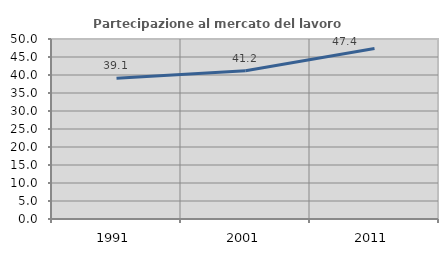
| Category | Partecipazione al mercato del lavoro  femminile |
|---|---|
| 1991.0 | 39.12 |
| 2001.0 | 41.193 |
| 2011.0 | 47.375 |